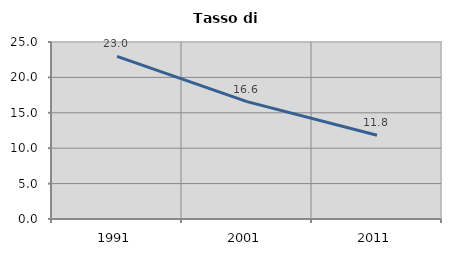
| Category | Tasso di disoccupazione   |
|---|---|
| 1991.0 | 22.963 |
| 2001.0 | 16.582 |
| 2011.0 | 11.829 |